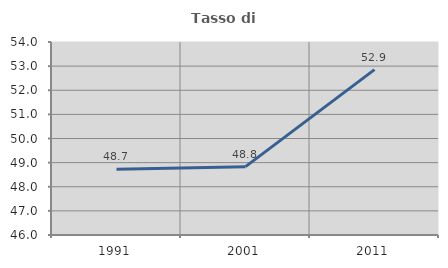
| Category | Tasso di occupazione   |
|---|---|
| 1991.0 | 48.725 |
| 2001.0 | 48.834 |
| 2011.0 | 52.854 |